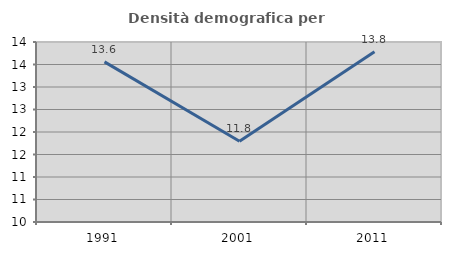
| Category | Densità demografica |
|---|---|
| 1991.0 | 13.559 |
| 2001.0 | 11.795 |
| 2011.0 | 13.783 |